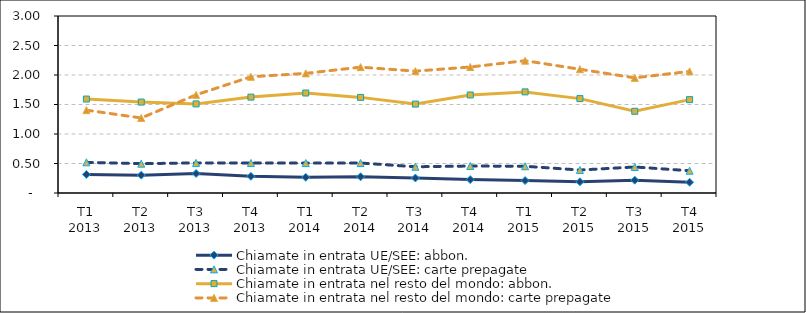
| Category | Chiamate in entrata UE/SEE: abbon. | Chiamate in entrata UE/SEE: carte prepagate | Chiamate in entrata nel resto del mondo: abbon. | Chiamate in entrata nel resto del mondo: carte prepagate |
|---|---|---|---|---|
| T1 2013 | 0.315 | 0.52 | 1.592 | 1.404 |
| T2 2013 | 0.302 | 0.497 | 1.541 | 1.272 |
| T3 2013 | 0.331 | 0.51 | 1.51 | 1.664 |
| T4 2013 | 0.283 | 0.509 | 1.625 | 1.97 |
| T1 2014 | 0.266 | 0.507 | 1.695 | 2.027 |
| T2 2014 | 0.275 | 0.508 | 1.621 | 2.133 |
| T3 2014 | 0.254 | 0.445 | 1.507 | 2.066 |
| T4 2014 | 0.228 | 0.457 | 1.661 | 2.136 |
| T1 2015 | 0.211 | 0.453 | 1.714 | 2.243 |
| T2 2015 | 0.19 | 0.389 | 1.6 | 2.097 |
| T3 2015 | 0.217 | 0.441 | 1.385 | 1.951 |
| T4 2015 | 0.182 | 0.378 | 1.582 | 2.062 |